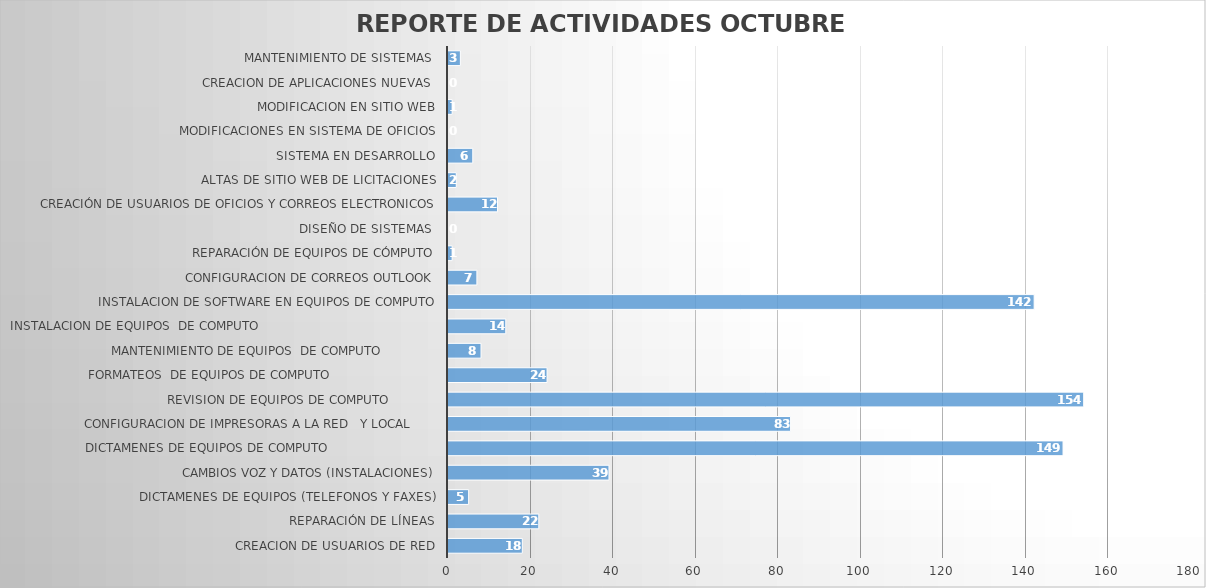
| Category | sep-22 |
|---|---|
| CREACION DE USUARIOS DE RED | 18 |
| REPARACIÓN DE LÍNEAS | 22 |
| DICTAMENES DE EQUIPOS (TELEFONOS Y FAXES) | 5 |
| CAMBIOS VOZ Y DATOS (INSTALACIONES) | 39 |
| DICTAMENES DE EQUIPOS DE COMPUTO                             | 149 |
| CONFIGURACION DE IMPRESORAS A LA RED   Y LOCAL       | 83 |
| REVISION DE EQUIPOS DE COMPUTO             | 154 |
| FORMATEOS  DE EQUIPOS DE COMPUTO                            | 24 |
| MANTENIMIENTO DE EQUIPOS  DE COMPUTO               | 8 |
| INSTALACION DE EQUIPOS  DE COMPUTO                                               | 14 |
| INSTALACION DE SOFTWARE EN EQUIPOS DE COMPUTO | 142 |
| CONFIGURACION DE CORREOS OUTLOOK | 7 |
| REPARACIÓN DE EQUIPOS DE CÓMPUTO | 1 |
| DISEÑO DE SISTEMAS  | 0 |
| CREACIÓN DE USUARIOS DE OFICIOS Y CORREOS ELECTRONICOS | 12 |
| ALTAS DE SITIO WEB DE LICITACIONES | 2 |
| SISTEMA EN DESARROLLO | 6 |
| MODIFICACIONES EN SISTEMA DE OFICIOS | 0 |
| MODIFICACION EN SITIO WEB | 1 |
| CREACION DE APLICACIONES NUEVAS  | 0 |
| MANTENIMIENTO DE SISTEMAS  | 3 |